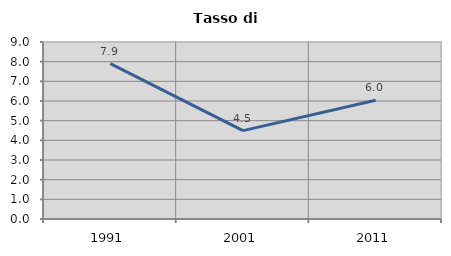
| Category | Tasso di disoccupazione   |
|---|---|
| 1991.0 | 7.905 |
| 2001.0 | 4.493 |
| 2011.0 | 6.037 |